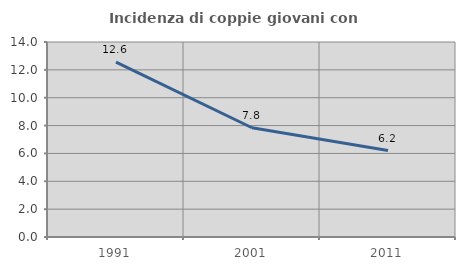
| Category | Incidenza di coppie giovani con figli |
|---|---|
| 1991.0 | 12.557 |
| 2001.0 | 7.842 |
| 2011.0 | 6.205 |